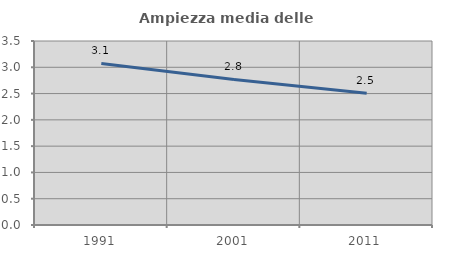
| Category | Ampiezza media delle famiglie |
|---|---|
| 1991.0 | 3.072 |
| 2001.0 | 2.769 |
| 2011.0 | 2.508 |